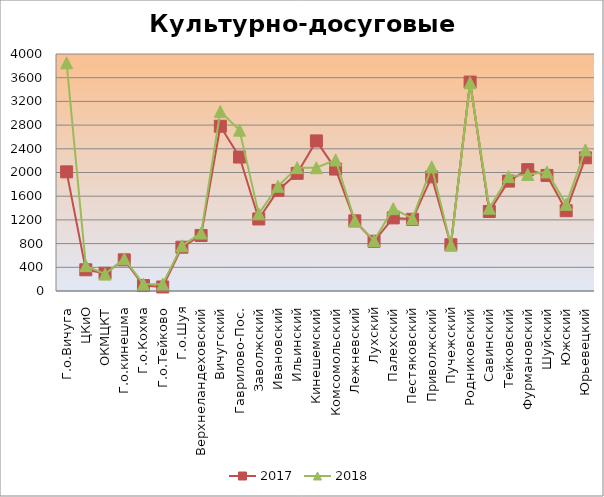
| Category | 2017 | 2018 |
|---|---|---|
| Г.о.Вичуга | 2011 | 3851 |
| ЦКиО | 358 | 428 |
| ОКМЦКТ | 300 | 285 |
| Г.о.кинешма | 526 | 544 |
| Г.о.Кохма | 92 | 115 |
| Г.о.Тейково | 68 | 117 |
| Г.о.Шуя | 739 | 763 |
| Верхнеландеховский | 937 | 978 |
| Вичугский | 2781 | 3031 |
| Гаврилово-Пос. | 2261 | 2715 |
| Заволжский | 1216 | 1302 |
| Ивановский | 1698 | 1768 |
| Ильинский | 1986 | 2082 |
| Кинешемский | 2533 | 2080 |
| Комсомольский | 2058 | 2212 |
| Лежневский | 1184 | 1185 |
| Лухский | 839 | 851 |
| Палехский | 1234 | 1390 |
| Пестяковский | 1210 | 1222 |
| Приволжский | 1926 | 2095 |
| Пучежский | 781 | 773 |
| Родниковский | 3526 | 3515 |
| Савинский | 1342 | 1398 |
| Тейковский | 1855 | 1931 |
| Фурмановский | 2048 | 1967 |
| Шуйский | 1950 | 2010 |
| Южский | 1355 | 1463 |
| Юрьевецкий | 2248 | 2382 |